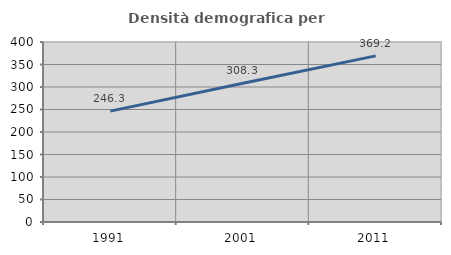
| Category | Densità demografica |
|---|---|
| 1991.0 | 246.332 |
| 2001.0 | 308.324 |
| 2011.0 | 369.171 |